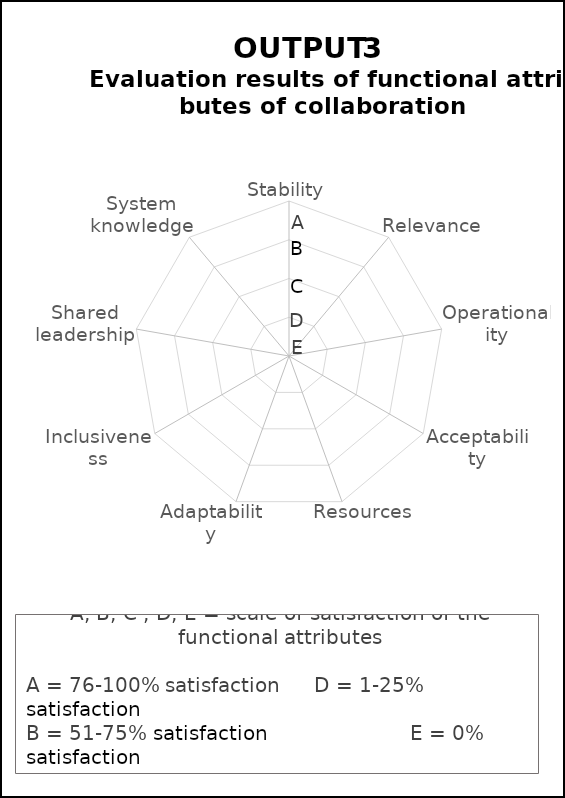
| Category | Series 0 |
|---|---|
| Stability | 0 |
| Relevance | 0 |
| Operationality | 0 |
| Acceptability | 0 |
| Resources | 0 |
| Adaptability | 0 |
| Inclusiveness | 0 |
| Shared leadership | 0 |
| System knowledge | 0 |